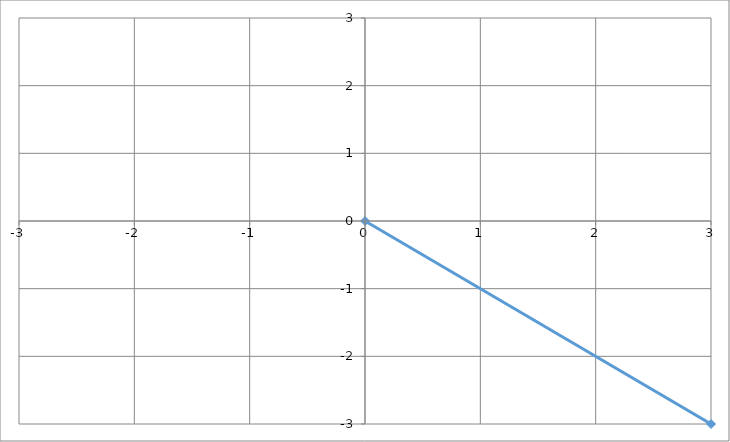
| Category | Series 0 |
|---|---|
| 0.0 | 0 |
| 3.0 | -3 |